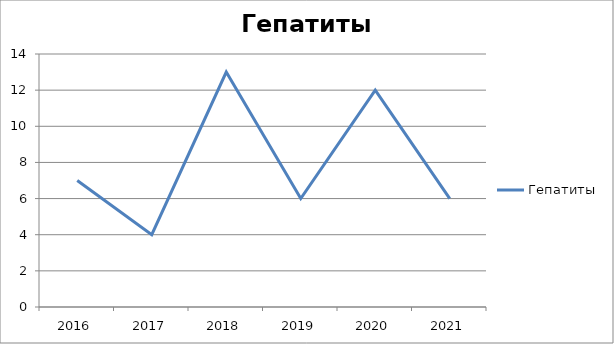
| Category | Гепатиты |
|---|---|
| 2016.0 | 7 |
| 2017.0 | 4 |
| 2018.0 | 13 |
| 2019.0 | 6 |
| 2020.0 | 12 |
| 2021.0 | 6 |